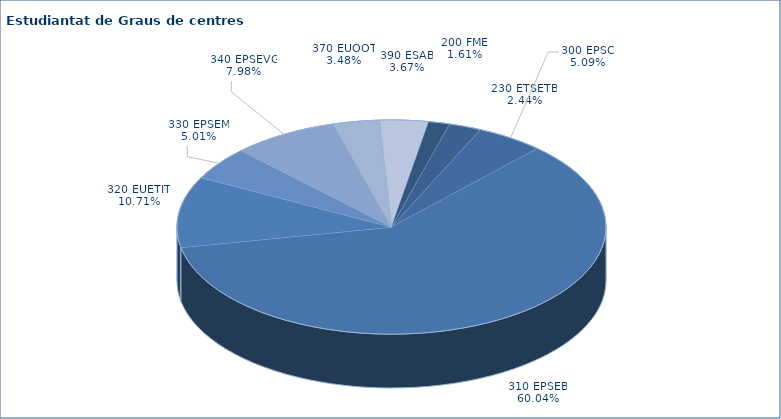
| Category | Series 0 |
|---|---|
| 200 FME | 60 |
| 230 ETSETB | 91 |
| 300 EPSC | 190 |
| 310 EPSEB | 2243 |
| 320 EUETIT | 400 |
| 330 EPSEM | 187 |
| 340 EPSEVG | 298 |
| 370 EUOOT | 130 |
| 390 ESAB | 137 |
| 162 CFIS | 0 |